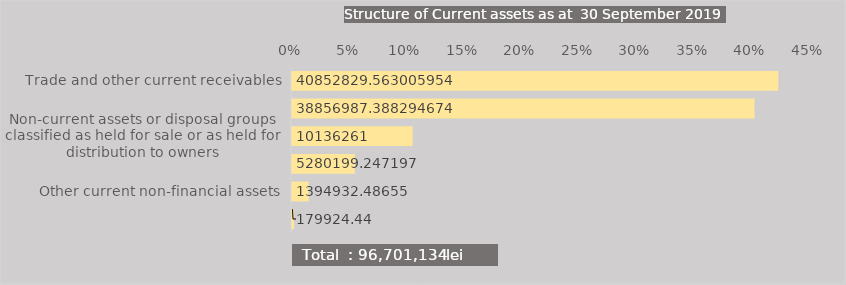
| Category | Series 0 |
|---|---|
| Trade and other current receivables | 0.422 |
| Current inventories | 0.402 |
| Non-current assets or disposal groups classified as held for sale or as held for distribution to owners | 0.105 |
| Cash and cash equivalents | 0.055 |
| Other current non-financial assets | 0.014 |
| Other current financial assets | 0.002 |